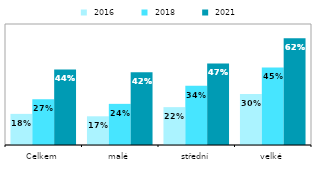
| Category |  2016 |  2018 |  2021 |
|---|---|---|---|
| Celkem | 0.18 | 0.265 | 0.437 |
| malé | 0.166 | 0.238 | 0.421 |
| střední | 0.219 | 0.343 | 0.472 |
| velké | 0.295 | 0.449 | 0.618 |